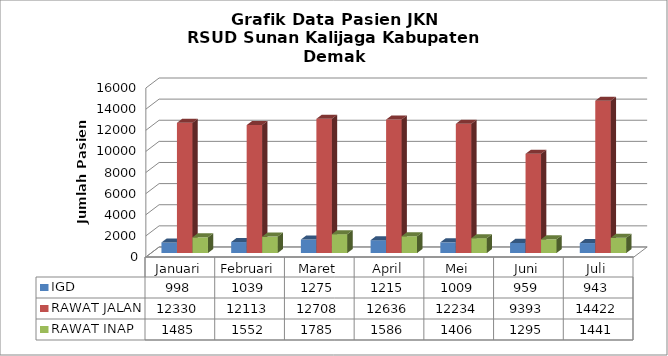
| Category | IGD | RAWAT JALAN | RAWAT INAP |
|---|---|---|---|
| 0 | 998 | 12330 | 1485 |
| 1 | 1039 | 12113 | 1552 |
| 2 | 1275 | 12708 | 1785 |
| 3 | 1215 | 12636 | 1586 |
| 4 | 1009 | 12234 | 1406 |
| 5 | 959 | 9393 | 1295 |
| 6 | 943 | 14422 | 1441 |